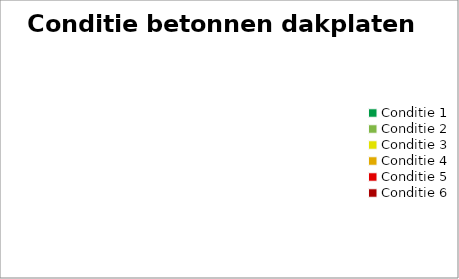
| Category | Conditie betonnen dakplaten |
|---|---|
| Conditie 1 | 0 |
| Conditie 2 | 0 |
| Conditie 3 | 0 |
| Conditie 4 | 0 |
| Conditie 5 | 0 |
| Conditie 6 | 0 |